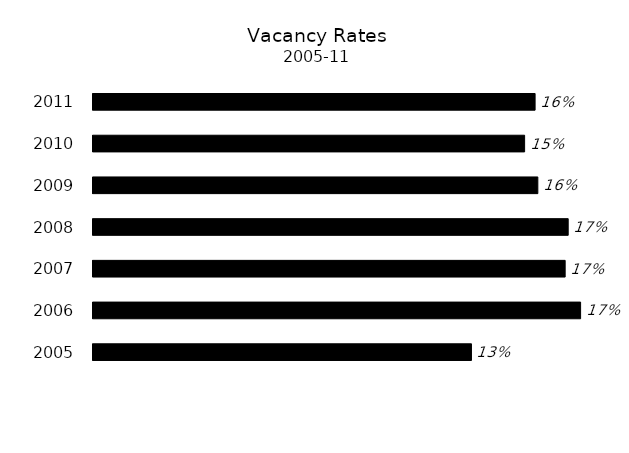
| Category | Series 0 |
|---|---|
| 2005 | 0.133 |
| 2006 | 0.171 |
| 2007 | 0.166 |
| 2008 | 0.167 |
| 2009 | 0.156 |
| 2010 | 0.152 |
| 2011 | 0.155 |